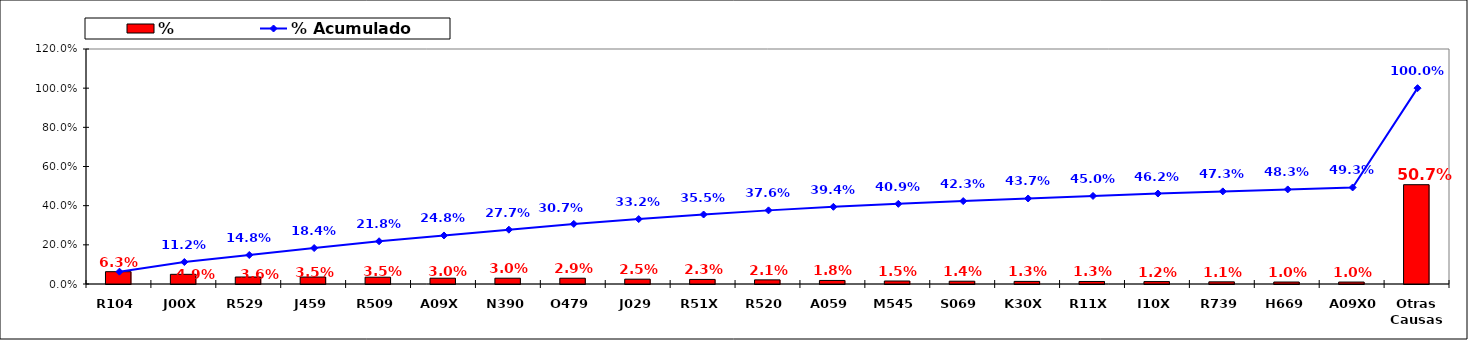
| Category | % |
|---|---|
| R104 | 0.063 |
| J00X | 0.049 |
| R529 | 0.036 |
| J459 | 0.035 |
| R509 | 0.035 |
| A09X | 0.03 |
| N390 | 0.03 |
| O479 | 0.029 |
| J029 | 0.025 |
| R51X | 0.023 |
| R520 | 0.021 |
| A059 | 0.018 |
| M545 | 0.015 |
| S069 | 0.014 |
| K30X | 0.013 |
| R11X | 0.013 |
| I10X | 0.012 |
| R739 | 0.011 |
| H669 | 0.01 |
| A09X0 | 0.01 |
| Otras Causas | 0.507 |